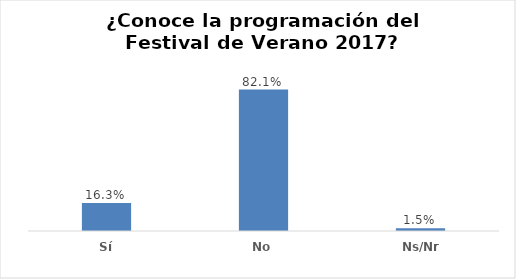
| Category | Series 0 |
|---|---|
| Sí | 0.163 |
| No | 0.821 |
| Ns/Nr | 0.015 |